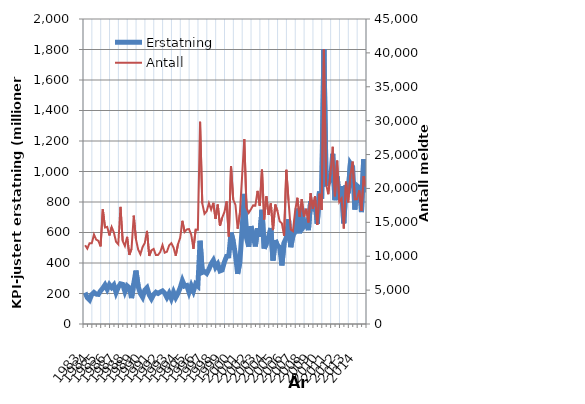
| Category | Erstatning |
|---|---|
| 1983.0 | 205.859 |
| nan | 172.439 |
| nan | 157.695 |
| nan | 193.17 |
| 1984.0 | 207.142 |
| nan | 195.941 |
| nan | 194.272 |
| nan | 217.294 |
| 1985.0 | 234.815 |
| nan | 256.66 |
| nan | 227.431 |
| nan | 257.937 |
| 1986.0 | 239.147 |
| nan | 255.898 |
| nan | 205.963 |
| nan | 241.024 |
| 1987.0 | 263.314 |
| nan | 259.842 |
| nan | 212.64 |
| nan | 250.177 |
| 1988.0 | 238.119 |
| nan | 169.742 |
| nan | 264.377 |
| nan | 350.226 |
| 1989.0 | 247.426 |
| nan | 199.98 |
| nan | 175.966 |
| nan | 222 |
| 1990.0 | 237.704 |
| nan | 191.233 |
| nan | 165.85 |
| nan | 193.043 |
| 1991.0 | 208.312 |
| nan | 200.291 |
| nan | 209.618 |
| nan | 216.719 |
| 1992.0 | 202.456 |
| nan | 174.447 |
| nan | 201.569 |
| nan | 166.334 |
| 1993.0 | 208.704 |
| nan | 173.688 |
| nan | 200.666 |
| nan | 237.394 |
| 1994.0 | 284.331 |
| nan | 248.57 |
| nan | 252.544 |
| nan | 208.159 |
| 1995.0 | 250.788 |
| nan | 215.752 |
| nan | 262.161 |
| nan | 248.909 |
| 1996.0 | 545.856 |
| nan | 338.003 |
| nan | 344.042 |
| nan | 331.801 |
| 1997.0 | 359.204 |
| nan | 394.166 |
| nan | 417.426 |
| nan | 372.44 |
| 1998.0 | 392.915 |
| nan | 348.086 |
| nan | 353.773 |
| nan | 406.622 |
| 1999.0 | 443.507 |
| nan | 445.662 |
| nan | 599.695 |
| nan | 543.103 |
| 2000.0 | 452.712 |
| nan | 328.768 |
| nan | 407.58 |
| nan | 621.434 |
| 2001.0 | 852.847 |
| nan | 564.588 |
| nan | 507.075 |
| nan | 641.553 |
| 2002.0 | 584.299 |
| nan | 508.397 |
| nan | 628.291 |
| nan | 572.513 |
| 2003.0 | 748.769 |
| nan | 495.059 |
| nan | 526.68 |
| nan | 573.74 |
| 2004.0 | 629.424 |
| nan | 416.133 |
| nan | 550.144 |
| nan | 514.216 |
| 2005.0 | 503.291 |
| nan | 384.081 |
| nan | 533.208 |
| nan | 565.067 |
| 2006.0 | 686.848 |
| nan | 503.708 |
| nan | 579.578 |
| nan | 604.661 |
| 2007.0 | 756.853 |
| nan | 595.046 |
| nan | 760.271 |
| nan | 642.795 |
| 2008.0 | 664.734 |
| nan | 615.377 |
| nan | 803.718 |
| nan | 771.888 |
| 2009.0 | 810.01 |
| nan | 657.599 |
| nan | 868.671 |
| nan | 821.076 |
| 2010.0 | 1801.107 |
| nan | 918.654 |
| nan | 923.074 |
| nan | 944.344 |
| 2011.0 | 1116.041 |
| nan | 811.559 |
| nan | 967.659 |
| nan | 815.509 |
| 2012.0 | 903.472 |
| nan | 660.521 |
| nan | 910.673 |
| nan | 857.485 |
| 2013.0 | 1053.081 |
| nan | 1031.165 |
| nan | 750.323 |
| nan | 906.303 |
| 2014.0 | 893.859 |
| nan | 734.034 |
| nan | 1079.804 |
| nan | 863.368 |